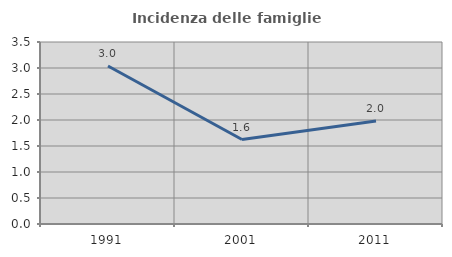
| Category | Incidenza delle famiglie numerose |
|---|---|
| 1991.0 | 3.039 |
| 2001.0 | 1.625 |
| 2011.0 | 1.98 |